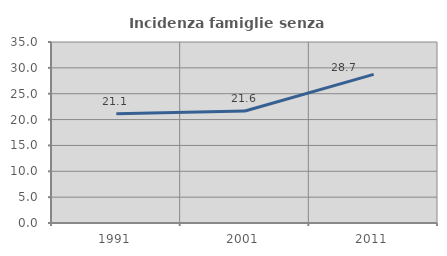
| Category | Incidenza famiglie senza nuclei |
|---|---|
| 1991.0 | 21.142 |
| 2001.0 | 21.646 |
| 2011.0 | 28.747 |